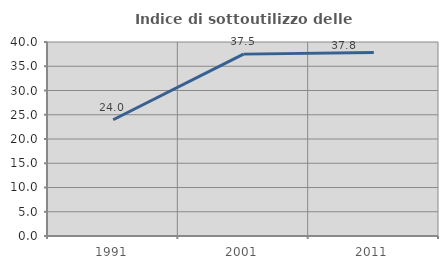
| Category | Indice di sottoutilizzo delle abitazioni  |
|---|---|
| 1991.0 | 23.97 |
| 2001.0 | 37.5 |
| 2011.0 | 37.838 |